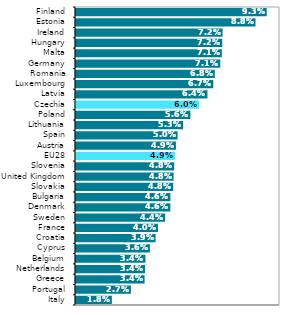
| Category | Celkem |
|---|---|
| Italy | 0.018 |
| Portugal | 0.027 |
| Greece | 0.034 |
| Netherlands | 0.034 |
| Belgium | 0.034 |
| Cyprus | 0.036 |
| Croatia | 0.039 |
| France | 0.04 |
| Sweden | 0.044 |
| Denmark | 0.046 |
| Bulgaria | 0.046 |
| Slovakia | 0.048 |
| United Kingdom | 0.048 |
| Slovenia | 0.048 |
| EU28 | 0.049 |
| Austria | 0.049 |
| Spain | 0.05 |
| Lithuania | 0.053 |
| Poland | 0.056 |
| Czechia | 0.06 |
| Latvia | 0.064 |
| Luxembourg | 0.067 |
| Romania | 0.068 |
| Germany | 0.071 |
| Malta | 0.071 |
| Hungary | 0.072 |
| Ireland | 0.072 |
| Estonia | 0.088 |
| Finland | 0.093 |